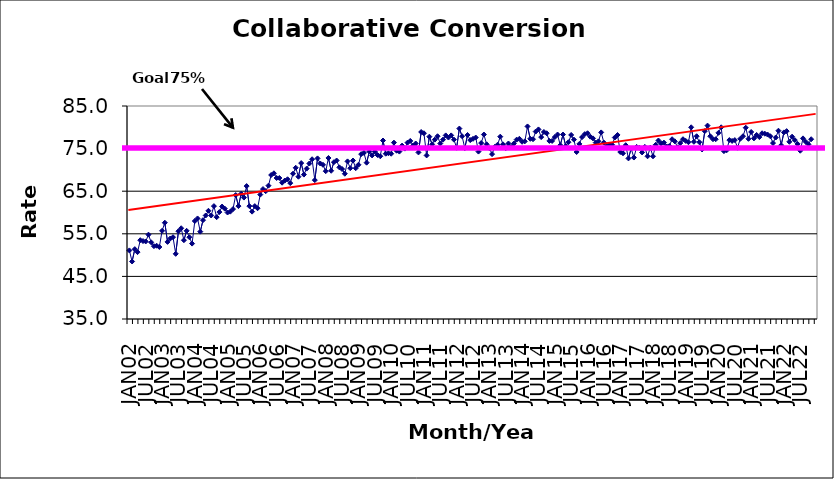
| Category | Series 0 |
|---|---|
| JAN02 | 51.1 |
| FEB02 | 48.5 |
| MAR02 | 51.4 |
| APR02 | 50.7 |
| MAY02 | 53.5 |
| JUN02 | 53.3 |
| JUL02 | 53.2 |
| AUG02 | 54.8 |
| SEP02 | 53 |
| OCT02 | 52.1 |
| NOV02 | 52.2 |
| DEC02 | 51.9 |
| JAN03 | 55.7 |
| FEB03 | 57.6 |
| MAR03 | 53.1 |
| APR03 | 53.9 |
| MAY03 | 54.2 |
| JUN03 | 50.3 |
| JUL03 | 55.6 |
| AUG03 | 56.3 |
| SEP03 | 53.5 |
| OCT03 | 55.7 |
| NOV03 | 54.2 |
| DEC03 | 52.7 |
| JAN04 | 58 |
| FEB04 | 58.6 |
| MAR04 | 55.5 |
| APR04 | 58.2 |
| MAY04 | 59.3 |
| JUN04 | 60.4 |
| JUL04 | 59.3 |
| AUG04 | 61.5 |
| SEP04 | 58.9 |
| OCT04 | 60.1 |
| NOV04 | 61.4 |
| DEC04 | 60.9 |
| JAN05 | 60 |
| FEB05 | 60.2 |
| MAR05 | 60.8 |
| APR05 | 64.1 |
| MAY05 | 61.5 |
| JUN05 | 64.4 |
| JUL05 | 63.5 |
| AUG05 | 66.2 |
| SEP05 | 61.5 |
| OCT05 | 60.2 |
| NOV05 | 61.5 |
| DEC05 | 61 |
| JAN06 | 64.2 |
| FEB06 | 65.5 |
| MAR06 | 65 |
| APR06 | 66.3 |
| MAY06 | 68.8 |
| JUN06 | 69.2 |
| JUL06 | 68.1 |
| AUG06 | 68.1 |
| SEP06 | 67 |
| OCT06 | 67.5 |
| NOV06 | 67.8 |
| DEC06 | 66.9 |
| JAN07 | 69.1 |
| FEB07 | 70.5 |
| MAR07 | 68.4 |
| APR07 | 71.6 |
| MAY07 | 68.9 |
| JUN07 | 70.3 |
| JUL07 | 71.5 |
| AUG07 | 72.5 |
| SEP07 | 67.6 |
| OCT07 | 72.7 |
| NOV07 | 71.5 |
| DEC07 | 71.2 |
| JAN08 | 69.7 |
| FEB08 | 72.8 |
| MAR08 | 69.8 |
| APR08 | 71.8 |
| MAY08 | 72.2 |
| JUN08 | 70.6 |
| JUL08 | 70.2 |
| AUG08 | 69.1 |
| SEP08 | 72 |
| OCT08 | 70.4 |
| NOV08 | 72.2 |
| DEC08 | 70.4 |
| JAN09 | 71.2 |
| FEB09 | 73.7 |
| MAR09 | 74 |
| APR09 | 71.7 |
| MAY09 | 74.3 |
| JUN09 | 73.4 |
| JUL09 | 74.3 |
| AUG09 | 73.5 |
| SEP09 | 73.2 |
| OCT09 | 76.9 |
| NOV09 | 73.8 |
| DEC09 | 73.9 |
| JAN10 | 73.8 |
| FEB10 | 76.4 |
| MAR10 | 74.5 |
| APR10 | 74.3 |
| MAY10 | 75.7 |
| JUN10 | 75 |
| JUL10 | 76.4 |
| AUG10 | 76.8 |
| SEP10 | 75.7 |
| OCT10 | 76.2 |
| NOV10 | 74.1 |
| DEC10 | 78.9 |
| JAN11 | 78.6 |
| FEB11 | 73.4 |
| MAR11 | 77.8 |
| APR11 | 76 |
| MAY11 | 77.1 |
| JUN11 | 77.9 |
| JUL11 | 76.2 |
| AUG11 | 77.1 |
| SEP11 | 78.1 |
| OCT11 | 77.6 |
| NOV11 | 78.1 |
| DEC11 | 77.1 |
| JAN12 | 75.2 |
| FEB12 | 79.7 |
| MAR12 | 77.9 |
| APR12 | 75.1 |
| MAY12 | 78.2 |
| JUN12 | 77 |
| JUL12 | 77.3 |
| AUG12 | 77.6 |
| SEP12 | 74.3 |
| OCT12 | 76.3 |
| NOV12 | 78.3 |
| DEC12 | 76 |
| JAN13 | 75.1 |
| FEB13 | 73.7 |
| MAR13 | 75.4 |
| APR13 | 75.9 |
| MAY13 | 77.8 |
| JUN13 | 76 |
| JUL13 | 75.1 |
| AUG13 | 76.2 |
| SEP13 | 75.4 |
| OCT13 | 76.2 |
| NOV13 | 77.1 |
| DEC13 | 77.3 |
| JAN14 | 76.6 |
| FEB14 | 76.7 |
| MAR14 | 80.2 |
| APR14 | 77.3 |
| MAY14 | 77.2 |
| JUN14 | 79 |
| JUL14 | 79.5 |
| AUG14 | 77.7 |
| SEP14 | 78.9 |
| OCT14 | 78.6 |
| NOV14 | 76.8 |
| DEC14 | 76.8 |
| JAN15 | 77.7 |
| FEB15 | 78.3 |
| MAR15 | 75.8 |
| APR15 | 78.3 |
| MAY15 | 75.6 |
| JUN15 | 76.5 |
| JUL15 | 78.2 |
| AUG15 | 77.1 |
| SEP15 | 74.2 |
| OCT15 | 76.1 |
| NOV15 | 77.7 |
| DEC15 | 78.4 |
| JAN16 | 78.6 |
| FEB16 | 77.8 |
| MAR16 | 77.4 |
| APR16 | 76.4 |
| MAY16 | 76.7 |
| JUN16 | 78.8 |
| JUL16 | 76.4 |
| AUG16 | 75.5 |
| SEP16 | 75.9 |
| OCT16 | 75.9 |
| NOV16 | 77.6 |
| DEC16 | 78.2 |
| JAN17 | 74.2 |
| FEB17 | 73.9 |
| MAR17 | 75.8 |
| APR17 | 72.7 |
| MAY17 | 75 |
| JUN17 | 72.9 |
| JUL17 | 75.4 |
| AUG17 | 75.2 |
| SEP17 | 74.1 |
| OCT17 | 75.4 |
| NOV17 | 73.2 |
| DEC17 | 75.2 |
| JAN18 | 73.2 |
| FEB18 | 75.9 |
| MAR18 | 76.9 |
| APR18 | 76.2 |
| MAY18 | 76.4 |
| JUN18 | 75.5 |
| JUL18 | 75.6 |
| AUG18 | 77.2 |
| SEP18 | 76.7 |
| OCT18 | 75.3 |
| NOV18 | 76.3 |
| DEC18 | 77.2 |
| JAN19 | 76.8 |
| FEB19 | 76.5 |
| MAR19 | 80 |
| APR19 | 76.6 |
| MAY19 | 77.9 |
| JUN19 | 76.5 |
| JUL19 | 74.8 |
| AUG19 | 79.1 |
| SEP19 | 80.4 |
| OCT19 | 77.9 |
| NOV19 | 77.2 |
| DEC19 | 77.2 |
| JAN20 | 78.7 |
| FEB20 | 80 |
| MAR20 | 74.4 |
| APR20 | 74.6 |
| MAY20 | 77 |
| JUN20 | 76.8 |
| JUL20 | 77 |
| AUG20 | 75.2 |
| SEP20 | 77.3 |
| OCT20 | 77.9 |
| NOV20 | 79.9 |
| DEC20 | 77.3 |
| JAN21 | 78.9 |
| FEB21 | 77.4 |
| MAR21 | 78.2 |
| APR21 | 77.7 |
| MAY21 | 78.6 |
| JUN21 | 78.5 |
| JUL21 | 78.3 |
| AUG21 | 77.9 |
| SEP21 | 76.3 |
| OCT21 | 77.6 |
| NOV21 | 79.2 |
| DEC21 | 75.8 |
| JAN22 | 78.8 |
| FEB22 | 79.1 |
| MAR22 | 76.6 |
| APR22 | 77.8 |
| MAY22 | 77 |
| JUN22 | 76.1 |
| JUL22 | 74.5 |
| AUG22 | 77.4 |
| SEP22 | 76.6 |
| OCT22 | 76 |
| NOV22 | 77.2 |